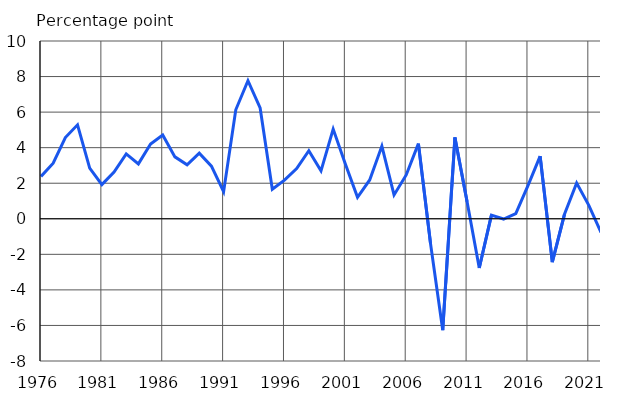
| Category | Percentage point |
|---|---|
| 1976 | 2.38 |
| 1977 | 3.128 |
| 1978 | 4.569 |
| 1979 | 5.285 |
| 1980 | 2.847 |
| 1981 | 1.921 |
| 1982 | 2.633 |
| 1983 | 3.651 |
| 1984 | 3.088 |
| 1985 | 4.202 |
| 1986 | 4.713 |
| 1987 | 3.483 |
| 1988 | 3.035 |
| 1989 | 3.694 |
| 1990 | 2.962 |
| 1991 | 1.528 |
| 1992 | 6.131 |
| 1993 | 7.767 |
| 1994 | 6.236 |
| 1995 | 1.659 |
| 1996 | 2.172 |
| 1997 | 2.82 |
| 1998 | 3.829 |
| 1999 | 2.695 |
| 2000 | 5.045 |
| 2001 | 3.083 |
| 2002 | 1.204 |
| 2003 | 2.185 |
| 2004 | 4.091 |
| 2005 | 1.342 |
| 2006 | 2.466 |
| 2007 | 4.228 |
| 2008 | -1.409 |
| 2009 | -6.268 |
| 2010 | 4.575 |
| 2011 | 0.962 |
| 2012 | -2.77 |
| 2013 | 0.202 |
| 2014 | -0.014 |
| 2015 | 0.291 |
| 2016 | 1.861 |
| 2017 | 3.527 |
| 2018 | -2.439 |
| 2019 | 0.252 |
| 2020 | 2.012 |
| 2021 | 0.758 |
| 2022* | -0.772 |